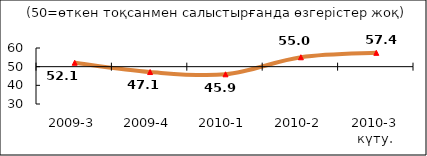
| Category | Series 5 |
|---|---|
| 2009-3 | 52.08 |
| 2009-4 | 47.12 |
| 2010-1 | 45.905 |
| 2010-2 | 55.03 |
| 2010-3 күту. | 57.405 |